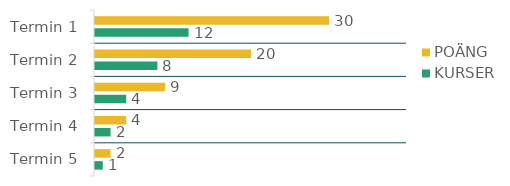
| Category | POÄNG  | KURSER  |
|---|---|---|
| Termin 1 | 30 | 12 |
| Termin 2 | 20 | 8 |
| Termin 3 | 9 | 4 |
| Termin 4 | 4 | 2 |
| Termin 5 | 2 | 1 |